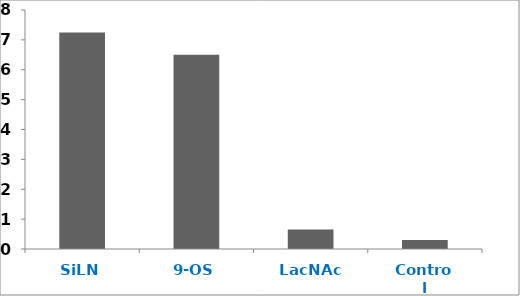
| Category | Series 0 |
|---|---|
| SiLN | 7.25 |
| 9-OS | 6.5 |
| LacNAc | 0.65 |
| Control | 0.3 |